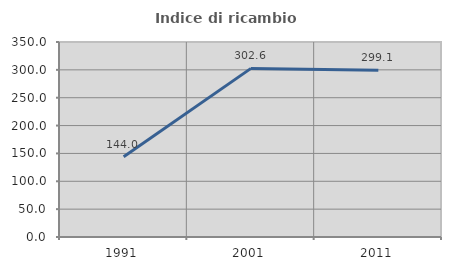
| Category | Indice di ricambio occupazionale  |
|---|---|
| 1991.0 | 143.972 |
| 2001.0 | 302.632 |
| 2011.0 | 299.091 |